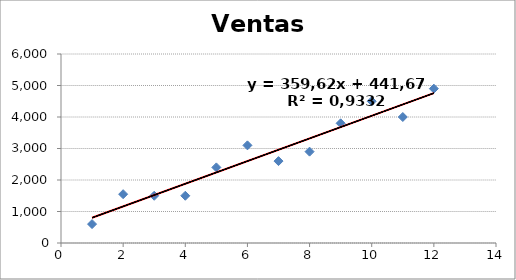
| Category | Ventas |
|---|---|
| 1.0 | 600 |
| 2.0 | 1550 |
| 3.0 | 1500 |
| 4.0 | 1500 |
| 5.0 | 2400 |
| 6.0 | 3100 |
| 7.0 | 2600 |
| 8.0 | 2900 |
| 9.0 | 3800 |
| 10.0 | 4500 |
| 11.0 | 4000 |
| 12.0 | 4900 |